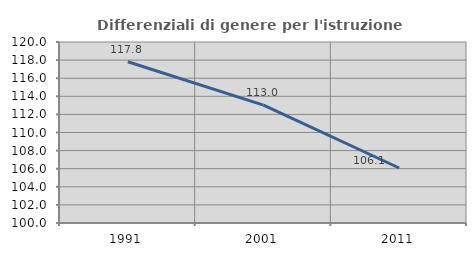
| Category | Differenziali di genere per l'istruzione superiore |
|---|---|
| 1991.0 | 117.822 |
| 2001.0 | 113.029 |
| 2011.0 | 106.078 |